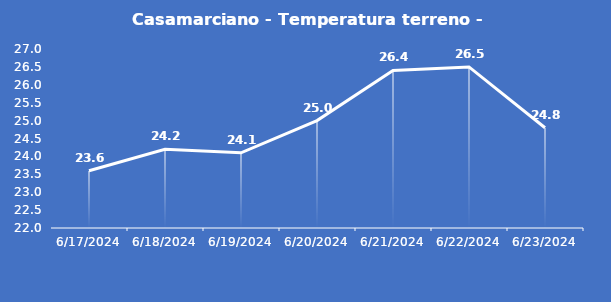
| Category | Casamarciano - Temperatura terreno - Grezzo (°C) |
|---|---|
| 6/17/24 | 23.6 |
| 6/18/24 | 24.2 |
| 6/19/24 | 24.1 |
| 6/20/24 | 25 |
| 6/21/24 | 26.4 |
| 6/22/24 | 26.5 |
| 6/23/24 | 24.8 |